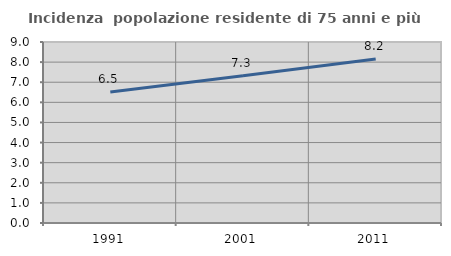
| Category | Incidenza  popolazione residente di 75 anni e più |
|---|---|
| 1991.0 | 6.509 |
| 2001.0 | 7.322 |
| 2011.0 | 8.153 |